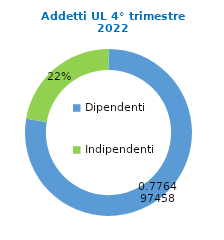
| Category | Series 0 |
|---|---|
| Dipendenti | 75137 |
| Indipendenti | 21627 |